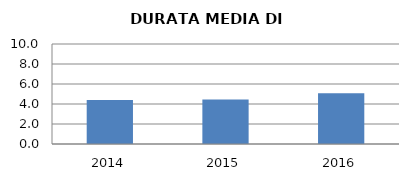
| Category | 2014 2015 2016 |
|---|---|
| 2014.0 | 4.4 |
| 2015.0 | 4.45 |
| 2016.0 | 5.074 |